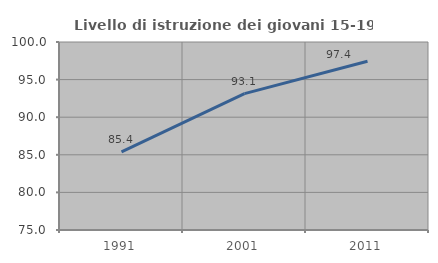
| Category | Livello di istruzione dei giovani 15-19 anni |
|---|---|
| 1991.0 | 85.387 |
| 2001.0 | 93.141 |
| 2011.0 | 97.449 |